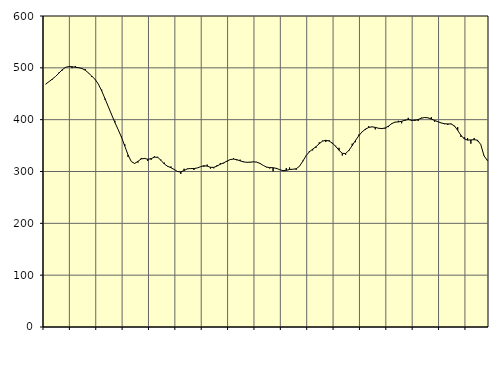
| Category | Piggar | Series 1 |
|---|---|---|
| nan | 468.3 | 468.64 |
| 87.0 | 473.2 | 473.27 |
| 87.0 | 477.1 | 478.19 |
| 87.0 | 483.4 | 483.36 |
| nan | 490.8 | 489.68 |
| 88.0 | 494.7 | 496.19 |
| 88.0 | 501.2 | 500.78 |
| 88.0 | 502.7 | 502.53 |
| nan | 499.3 | 502.12 |
| 89.0 | 503.5 | 501.16 |
| 89.0 | 499.8 | 500.27 |
| 89.0 | 499.3 | 498.77 |
| nan | 497.6 | 495.47 |
| 90.0 | 489.7 | 490.11 |
| 90.0 | 482.4 | 484.08 |
| 90.0 | 477.3 | 477.71 |
| nan | 468.5 | 468.56 |
| 91.0 | 458 | 455.62 |
| 91.0 | 438.8 | 440.61 |
| 91.0 | 425.5 | 425.21 |
| nan | 411 | 409.83 |
| 92.0 | 397.8 | 394.76 |
| 92.0 | 380.7 | 380.79 |
| 92.0 | 367.4 | 366.3 |
| nan | 352.6 | 349.25 |
| 93.0 | 328.4 | 331.86 |
| 93.0 | 319 | 319.08 |
| 93.0 | 314.9 | 315.53 |
| nan | 317.2 | 319.54 |
| 94.0 | 326.1 | 324.34 |
| 94.0 | 326.1 | 325.11 |
| 94.0 | 320.3 | 323.64 |
| nan | 322.6 | 324.79 |
| 95.0 | 329.4 | 327.69 |
| 95.0 | 328.2 | 327.28 |
| 95.0 | 322.7 | 321.52 |
| nan | 317.1 | 314.54 |
| 96.0 | 309.4 | 310.06 |
| 96.0 | 309.7 | 307.35 |
| 96.0 | 304.1 | 303.87 |
| nan | 300.6 | 299.99 |
| 97.0 | 295.4 | 299.1 |
| 97.0 | 305.3 | 301.93 |
| 97.0 | 305.7 | 304.98 |
| nan | 306.2 | 305.72 |
| 98.0 | 302.9 | 305.65 |
| 98.0 | 307 | 306.85 |
| 98.0 | 309.4 | 309.2 |
| nan | 309 | 311.21 |
| 99.0 | 313.3 | 310.31 |
| 99.0 | 305.6 | 308.15 |
| 99.0 | 306.2 | 307.92 |
| nan | 312.2 | 310.54 |
| 0.0 | 316.4 | 313.99 |
| 0.0 | 315.7 | 316.63 |
| 0.0 | 318.9 | 320.03 |
| nan | 323.8 | 323.02 |
| 1.0 | 325.5 | 323.99 |
| 1.0 | 321.6 | 322.84 |
| 1.0 | 322.8 | 320.55 |
| nan | 319.3 | 318.61 |
| 2.0 | 318.2 | 317.76 |
| 2.0 | 317.4 | 317.99 |
| 2.0 | 319.2 | 318.65 |
| nan | 318.4 | 318.16 |
| 3.0 | 315 | 315.73 |
| 3.0 | 311.8 | 311.75 |
| 3.0 | 308 | 308.57 |
| nan | 305.7 | 307.58 |
| 4.0 | 300.3 | 307.25 |
| 4.0 | 304.8 | 306.07 |
| 4.0 | 303.2 | 303.57 |
| nan | 302.6 | 301.65 |
| 5.0 | 306.5 | 302.21 |
| 5.0 | 307.8 | 303.84 |
| 5.0 | 304.4 | 304.35 |
| nan | 303.3 | 305.25 |
| 6.0 | 309.8 | 310.14 |
| 6.0 | 320.8 | 319.67 |
| 6.0 | 330.7 | 330.3 |
| nan | 339.5 | 337.97 |
| 7.0 | 340.7 | 342.98 |
| 7.0 | 345.6 | 347.82 |
| 7.0 | 356.2 | 353.62 |
| nan | 359.4 | 358.57 |
| 8.0 | 356.9 | 360.25 |
| 8.0 | 360.4 | 358.8 |
| 8.0 | 353 | 354.66 |
| nan | 349.6 | 348.44 |
| 9.0 | 345.7 | 340.89 |
| 9.0 | 330.8 | 334.98 |
| 9.0 | 332.3 | 334.72 |
| nan | 339.6 | 340.75 |
| 10.0 | 353.7 | 350.02 |
| 10.0 | 356.6 | 359.98 |
| 10.0 | 371.2 | 368.96 |
| nan | 376.6 | 376.46 |
| 11.0 | 380 | 381.64 |
| 11.0 | 387.4 | 384.91 |
| 11.0 | 385.9 | 386.21 |
| nan | 381.3 | 385.11 |
| 12.0 | 383 | 383.48 |
| 12.0 | 383.7 | 382.77 |
| 12.0 | 382.6 | 383.99 |
| nan | 385.7 | 387.49 |
| 13.0 | 393.1 | 392.34 |
| 13.0 | 395.6 | 395.27 |
| 13.0 | 397.8 | 395.64 |
| nan | 393 | 396.81 |
| 14.0 | 397.9 | 399.08 |
| 14.0 | 403.5 | 400.07 |
| 14.0 | 397.4 | 399 |
| nan | 400.2 | 398.5 |
| 15.0 | 397.5 | 400.34 |
| 15.0 | 403.8 | 402.81 |
| 15.0 | 403.8 | 404.24 |
| nan | 403.4 | 403.54 |
| 16.0 | 404.7 | 401.11 |
| 16.0 | 396 | 398.48 |
| 16.0 | 395.6 | 396.06 |
| nan | 393.4 | 393.71 |
| 17.0 | 391.4 | 392.1 |
| 17.0 | 389.8 | 391.82 |
| 17.0 | 392.3 | 391.7 |
| nan | 387.1 | 388.04 |
| 18.0 | 385.7 | 379.47 |
| 18.0 | 366.5 | 369.75 |
| 18.0 | 366.1 | 362.92 |
| nan | 364.5 | 360.58 |
| 19.0 | 353.7 | 360.93 |
| 19.0 | 364.6 | 361.37 |
| 19.0 | 358.4 | 360.44 |
| nan | 351.8 | 352.09 |
| 20.0 | 330.4 | 330.06 |
| 20.0 | 322.4 | 321.33 |